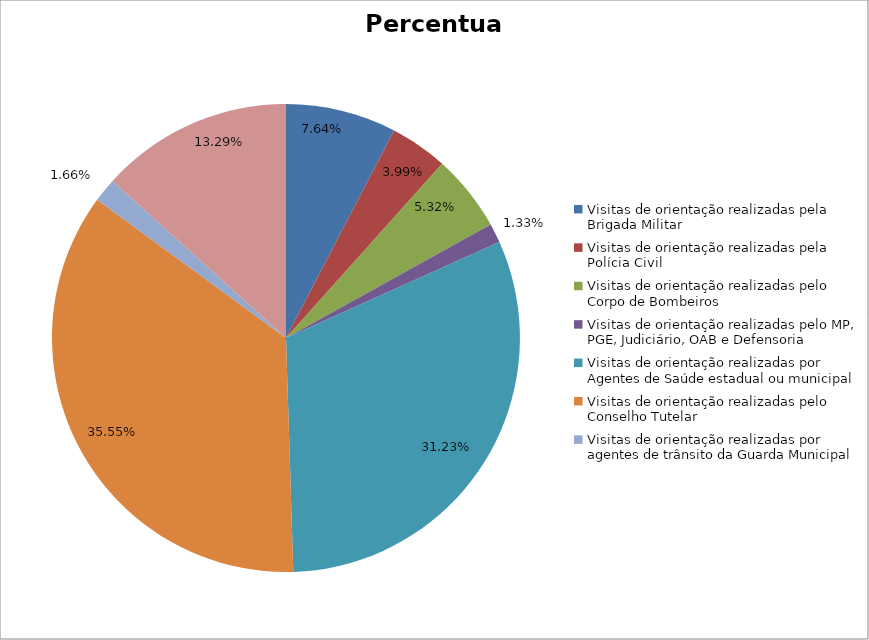
| Category | Percentual |
|---|---|
| Visitas de orientação realizadas pela Brigada Militar | 0.076 |
| Visitas de orientação realizadas pela Polícia Civil | 0.04 |
| Visitas de orientação realizadas pelo Corpo de Bombeiros | 0.053 |
| Visitas de orientação realizadas pelo MP, PGE, Judiciário, OAB e Defensoria | 0.013 |
| Visitas de orientação realizadas por Agentes de Saúde estadual ou municipal | 0.312 |
| Visitas de orientação realizadas pelo Conselho Tutelar | 0.355 |
| Visitas de orientação realizadas por agentes de trânsito da Guarda Municipal | 0.017 |
| Visitas de orientação realizadas por ONGs, entidades privadas, CRAS e CREAS | 0.133 |